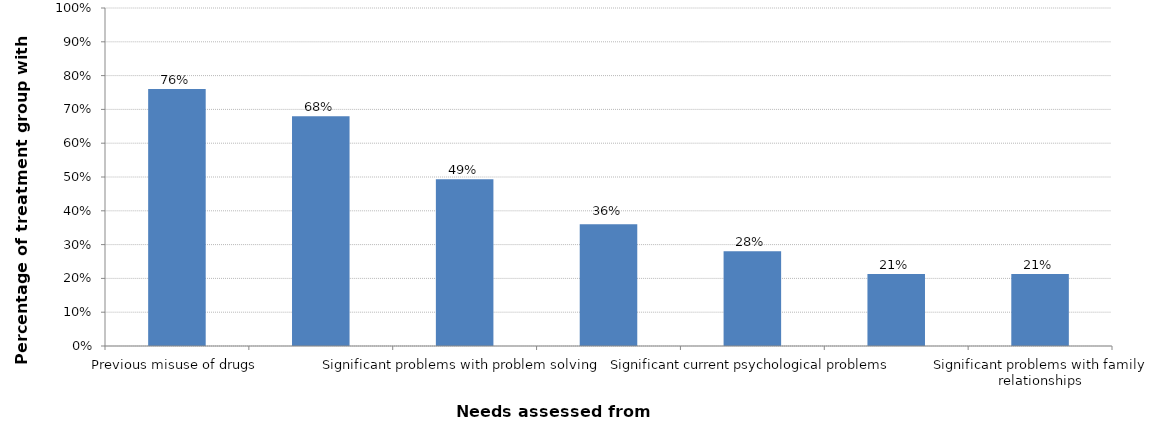
| Category | Percentage of treatment group with need |
|---|---|
| Previous misuse of drugs | 0.76 |
| Unemployed, or will be unemployed on release | 0.68 |
| Significant problems with problem solving | 0.493 |
| No fixed abode | 0.36 |
| Significant current psychological problems | 0.28 |
| Significant problem with current misuse of alcohol | 0.213 |
| Significant problems with family relationships | 0.213 |